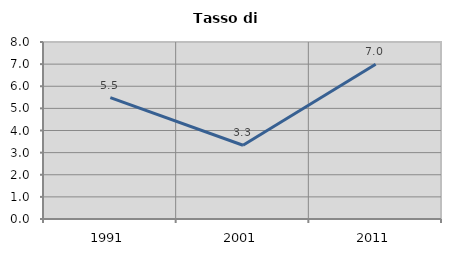
| Category | Tasso di disoccupazione   |
|---|---|
| 1991.0 | 5.484 |
| 2001.0 | 3.334 |
| 2011.0 | 6.996 |